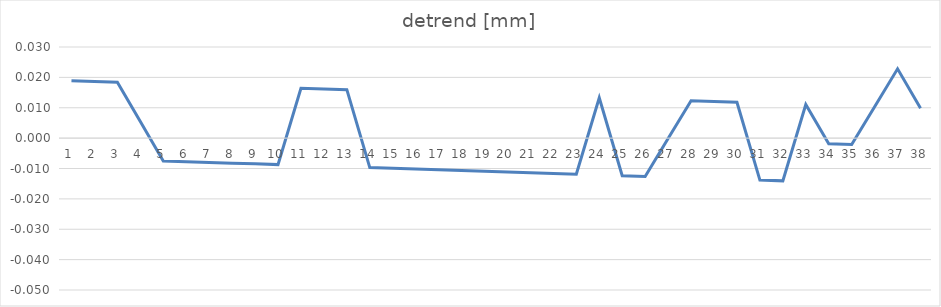
| Category | detrend [mm] |
|---|---|
| 0 | 0.019 |
| 1 | 0.019 |
| 2 | 0.018 |
| 3 | 0.005 |
| 4 | -0.008 |
| 5 | -0.008 |
| 6 | -0.008 |
| 7 | -0.008 |
| 8 | -0.008 |
| 9 | -0.009 |
| 10 | 0.016 |
| 11 | 0.016 |
| 12 | 0.016 |
| 13 | -0.01 |
| 14 | -0.01 |
| 15 | -0.01 |
| 16 | -0.01 |
| 17 | -0.011 |
| 18 | -0.011 |
| 19 | -0.011 |
| 20 | -0.011 |
| 21 | -0.012 |
| 22 | -0.012 |
| 23 | 0.013 |
| 24 | -0.012 |
| 25 | -0.013 |
| 26 | 0 |
| 27 | 0.012 |
| 28 | 0.012 |
| 29 | 0.012 |
| 30 | -0.014 |
| 31 | -0.014 |
| 32 | 0.011 |
| 33 | -0.002 |
| 34 | -0.002 |
| 35 | 0.01 |
| 36 | 0.023 |
| 37 | 0.01 |